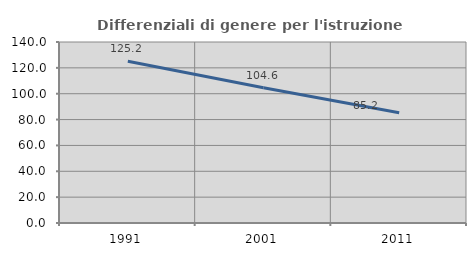
| Category | Differenziali di genere per l'istruzione superiore |
|---|---|
| 1991.0 | 125.161 |
| 2001.0 | 104.618 |
| 2011.0 | 85.202 |